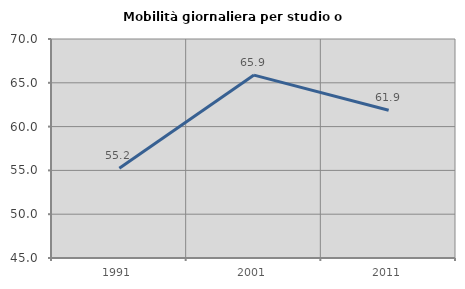
| Category | Mobilità giornaliera per studio o lavoro |
|---|---|
| 1991.0 | 55.234 |
| 2001.0 | 65.878 |
| 2011.0 | 61.869 |